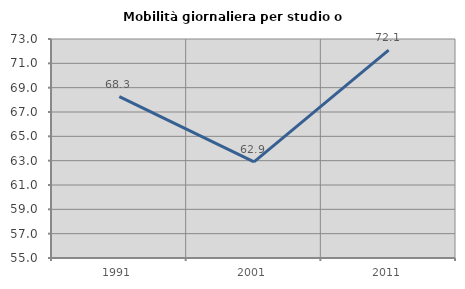
| Category | Mobilità giornaliera per studio o lavoro |
|---|---|
| 1991.0 | 68.258 |
| 2001.0 | 62.905 |
| 2011.0 | 72.085 |